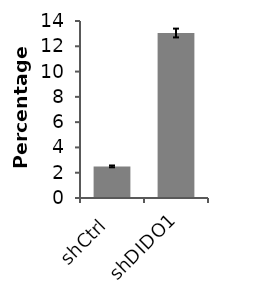
| Category | Series 0 |
|---|---|
| shCtrl | 2.5 |
| shDIDO1 | 13.05 |